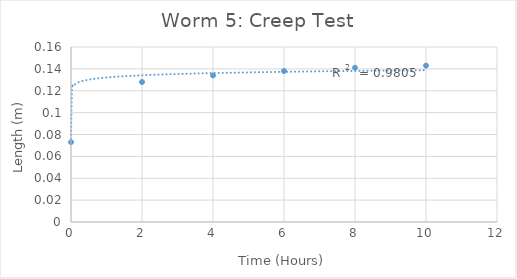
| Category | Series 0 |
|---|---|
| 1e-09 | 0.073 |
| 2.0 | 0.128 |
| 4.0 | 0.134 |
| 6.0 | 0.138 |
| 8.0 | 0.141 |
| 10.0 | 0.143 |